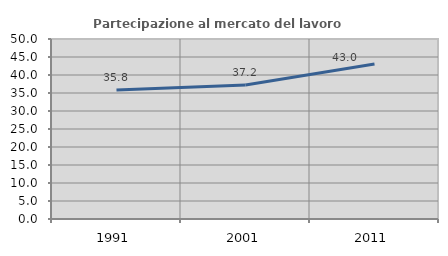
| Category | Partecipazione al mercato del lavoro  femminile |
|---|---|
| 1991.0 | 35.813 |
| 2001.0 | 37.246 |
| 2011.0 | 43.028 |